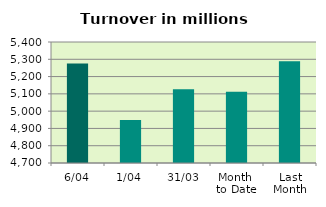
| Category | Series 0 |
|---|---|
| 6/04 | 5274.925 |
| 1/04 | 4948.635 |
| 31/03 | 5126.625 |
| Month 
to Date | 5111.78 |
| Last
Month | 5289.077 |